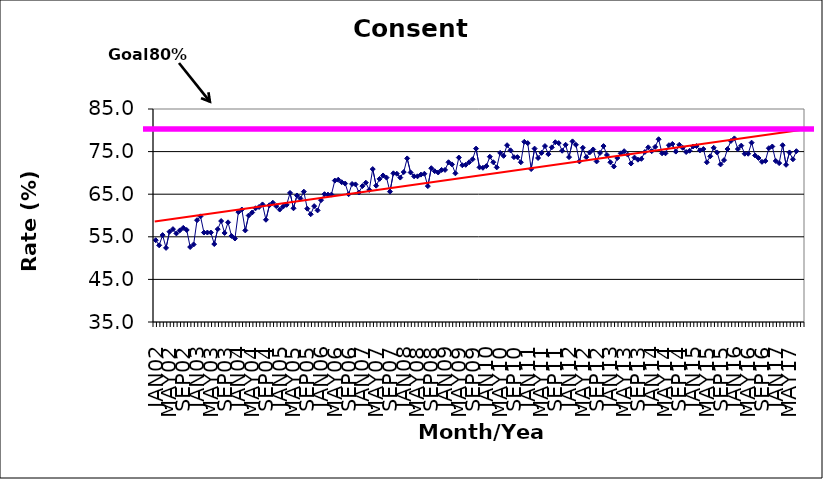
| Category | Series 0 |
|---|---|
| JAN02 | 54.2 |
| FEB02 | 53 |
| MAR02 | 55.4 |
| APR02 | 52.4 |
| MAY02 | 56.2 |
| JUN02 | 56.8 |
| JUL02 | 55.8 |
| AUG02 | 56.5 |
| SEP02 | 57.1 |
| OCT02 | 56.6 |
| NOV02 | 52.6 |
| DEC02 | 53.2 |
| JAN03 | 58.9 |
| FEB03 | 59.8 |
| MAR03 | 56 |
| APR03 | 56 |
| MAY03 | 56 |
| JUN03 | 53.3 |
| JUL03 | 56.8 |
| AUG03 | 58.7 |
| SEP03 | 55.9 |
| OCT03 | 58.4 |
| NOV03 | 55.2 |
| DEC03 | 54.6 |
| JAN04 | 60.8 |
| FEB04 | 61.4 |
| MAR04 | 56.5 |
| APR04 | 60 |
| MAY04 | 60.7 |
| JUN04 | 61.7 |
| JUL04 | 62 |
| AUG04 | 62.6 |
| SEP04 | 59 |
| OCT04 | 62.4 |
| NOV04 | 63 |
| DEC04 | 62.2 |
| JAN05 | 61.4 |
| FEB05 | 62.1 |
| MAR05 | 62.5 |
| APR05 | 65.3 |
| MAY05 | 61.7 |
| JUN05 | 64.7 |
| JUL05 | 64 |
| AUG05 | 65.6 |
| SEP05 | 61.6 |
| OCT05 | 60.3 |
| NOV05 | 62.2 |
| DEC05 | 61.2 |
| JAN06 | 63.6 |
| FEB06 | 65 |
| MAR06 | 64.9 |
| APR06 | 64.9 |
| MAY06 | 68.2 |
| JUN06 | 68.4 |
| JUL06 | 67.8 |
| AUG06 | 67.5 |
| SEP06 | 65 |
| OCT06 | 67.4 |
| NOV06 | 67.3 |
| DEC06 | 65.4 |
| JAN07 | 66.9 |
| FEB07 | 67.7 |
| MAR07 | 66 |
| APR07 | 70.9 |
| MAY07 | 67 |
| JUN07 | 68.6 |
| JUL07 | 69.4 |
| AUG07 | 68.9 |
| SEP07 | 65.6 |
| OCT07 | 69.9 |
| NOV07 | 69.8 |
| DEC07 | 68.9 |
| JAN08 | 70.2 |
| FEB08 | 73.4 |
| MAR08 | 70.1 |
| APR08 | 69.2 |
| MAY08 | 69.2 |
| JUN08 | 69.6 |
| JUL08 | 69.8 |
| AUG08 | 66.9 |
| SEP08 | 71.1 |
| OCT08 | 70.4 |
| NOV08 | 70.1 |
| DEC08 | 70.7 |
| JAN09 | 70.7 |
| FEB09 | 72.5 |
| MAR09 | 72 |
| APR09 | 69.9 |
| MAY09 | 73.6 |
| JUN09 | 71.8 |
| JUL09 | 71.9 |
| AUG09 | 72.5 |
| SEP09 | 73.2 |
| OCT09 | 75.7 |
| NOV09 | 71.3 |
| DEC09 | 71.2 |
| JAN10 | 71.6 |
| FEB10 | 73.8 |
| MAR10 | 72.5 |
| APR10 | 71.3 |
| MAY10 | 74.7 |
| JUN10 | 74 |
| JUL10 | 76.5 |
| AUG10 | 75.3 |
| SEP10 | 73.7 |
| OCT10 | 73.7 |
| NOV10 | 72.5 |
| DEC10 | 77.3 |
| JAN11 | 77 |
| FEB11 | 70.9 |
| MAR11 | 75.7 |
| APR11 | 73.5 |
| MAY11 | 74.7 |
| JUN11 | 76.3 |
| JUL11 | 74.4 |
| AUG11 | 76 |
| SEP11 | 77.2 |
| OCT11 | 77 |
| NOV11 | 75.2 |
| DEC11 | 76.6 |
| JAN12 | 73.7 |
| FEB12 | 77.4 |
| MAR12 | 76.6 |
| APR12 | 72.7 |
| MAY12 | 75.9 |
| JUN12 | 73.7 |
| JUL12 | 74.8 |
| AUG12 | 75.5 |
| SEP12 | 72.7 |
| OCT12 | 74.7 |
| NOV12 | 76.3 |
| DEC12 | 74.2 |
| JAN13 | 72.5 |
| FEB13 | 71.5 |
| MAR13 | 73.5 |
| APR13 | 74.6 |
| MAY13 | 75.1 |
| JUN13 | 74.3 |
| JUL13 | 72.2 |
| AUG13 | 73.6 |
| SEP13 | 73.1 |
| OCT13 | 73.3 |
| NOV13 | 74.9 |
| DEC13 | 76 |
| JAN14 | 75.1 |
| FEB14 | 76.1 |
| MAR14 | 77.9 |
| APR14 | 74.6 |
| MAY14 | 74.6 |
| JUN14 | 76.5 |
| JUL14 | 76.8 |
| AUG14 | 75 |
| SEP14 | 76.6 |
| OCT14 | 75.9 |
| NOV14 | 74.9 |
| DEC14 | 75.2 |
| JAN15 | 76.2 |
| FEB15 | 76.3 |
| MAR15 | 75.3 |
| APR15 | 75.6 |
| MAY15 | 72.5 |
| JUN15 | 73.9 |
| JUL15 | 75.9 |
| AUG15 | 74.8 |
| SEP15 | 72 |
| OCT15 | 73 |
| NOV15 | 75.6 |
| DEC15 | 77.5 |
| JAN16 | 78.1 |
| FEB16 | 75.6 |
| MAR16 | 76.4 |
| APR16 | 74.5 |
| MAY16 | 74.5 |
| JUN16 | 77.1 |
| JUL16 | 74.1 |
| AUG16 | 73.5 |
| SEP16 | 72.6 |
| OCT16 | 72.8 |
| NOV16 | 75.8 |
| DEC16 | 76.2 |
| JAN17 | 72.8 |
| FEB17 | 72.3 |
| MAR17 | 76.5 |
| APR17 | 71.9 |
| MAY17 | 74.8 |
| JUN17 | 73.2 |
| JUL17 | 75.1 |